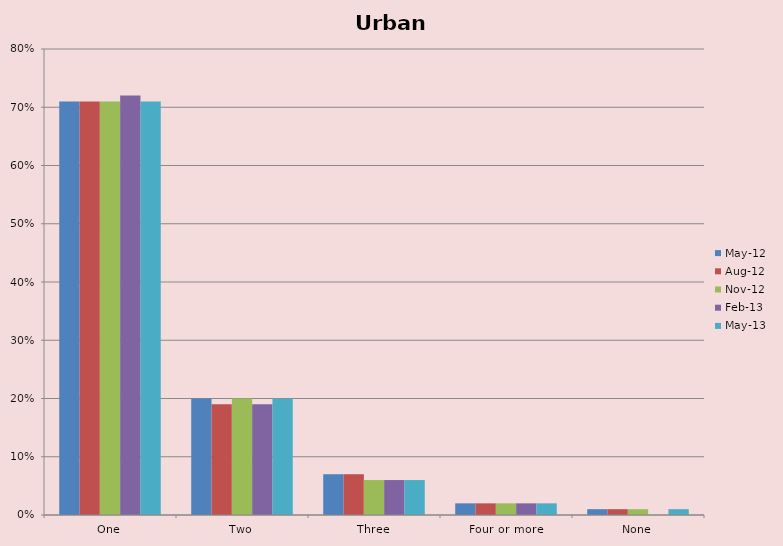
| Category | May-12 | Aug-12 | Nov-12 | Feb-13 | May-13 |
|---|---|---|---|---|---|
| One | 0.71 | 0.71 | 0.71 | 0.72 | 0.71 |
| Two | 0.2 | 0.19 | 0.2 | 0.19 | 0.2 |
| Three | 0.07 | 0.07 | 0.06 | 0.06 | 0.06 |
| Four or more | 0.02 | 0.02 | 0.02 | 0.02 | 0.02 |
| None | 0.01 | 0.01 | 0.01 | 0 | 0.01 |